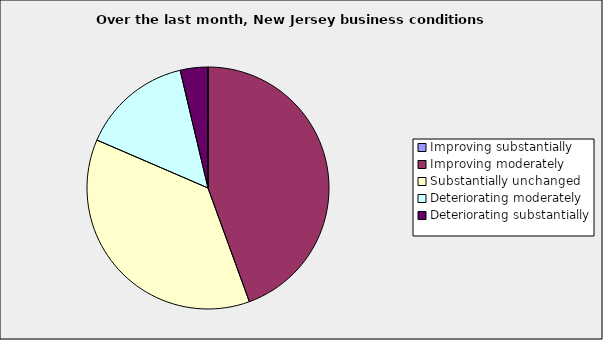
| Category | Series 0 |
|---|---|
| Improving substantially | 0 |
| Improving moderately | 0.444 |
| Substantially unchanged | 0.37 |
| Deteriorating moderately | 0.148 |
| Deteriorating substantially | 0.037 |